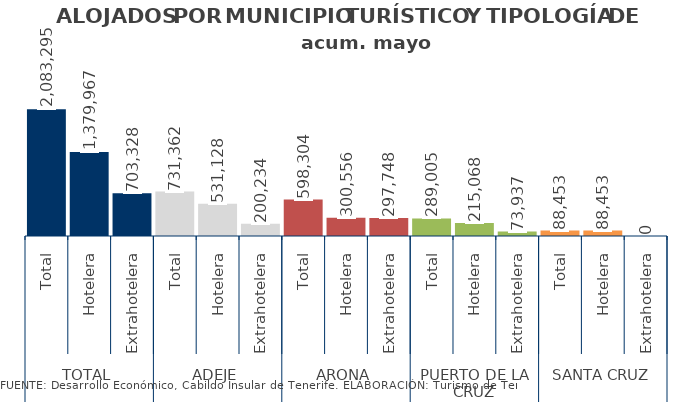
| Category | acum. mayo 2014 |
|---|---|
| 0 | 2083295 |
| 1 | 1379967 |
| 2 | 703328 |
| 3 | 731362 |
| 4 | 531128 |
| 5 | 200234 |
| 6 | 598304 |
| 7 | 300556 |
| 8 | 297748 |
| 9 | 289005 |
| 10 | 215068 |
| 11 | 73937 |
| 12 | 88453 |
| 13 | 88453 |
| 14 | 0 |